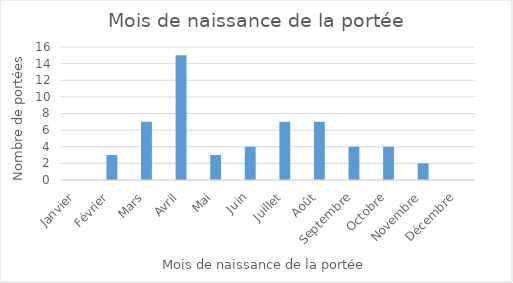
| Category | Series 0 |
|---|---|
| Janvier | 0 |
| Février | 3 |
| Mars | 7 |
| Avril | 15 |
| Mai | 3 |
| Juin | 4 |
| Juillet | 7 |
| Août | 7 |
| Septembre | 4 |
| Octobre | 4 |
| Novembre | 2 |
| Décembre | 0 |